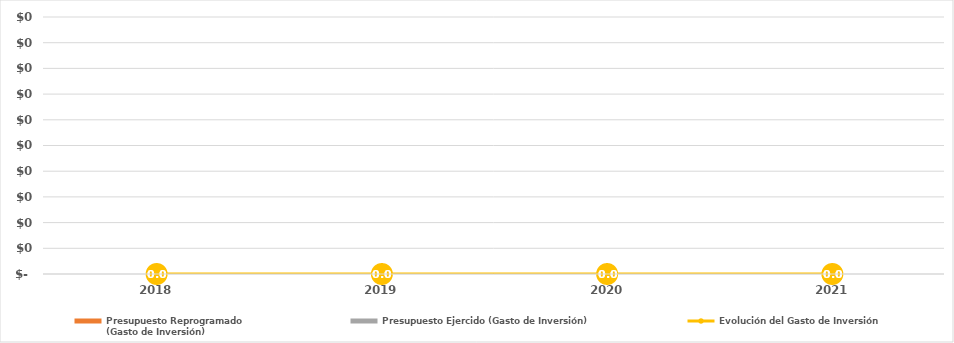
| Category | Presupuesto Reprogramado
(Gasto de Inversión) | Presupuesto Ejercido (Gasto de Inversión) |
|---|---|---|
| 2018.0 | 0 | 0 |
| 2019.0 | 0 | 0 |
| 2020.0 | 0 | 0 |
| 2021.0 | 0 | 0 |